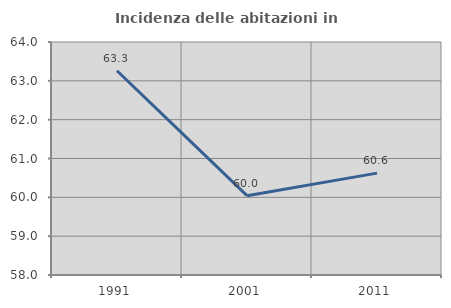
| Category | Incidenza delle abitazioni in proprietà  |
|---|---|
| 1991.0 | 63.26 |
| 2001.0 | 60.043 |
| 2011.0 | 60.623 |